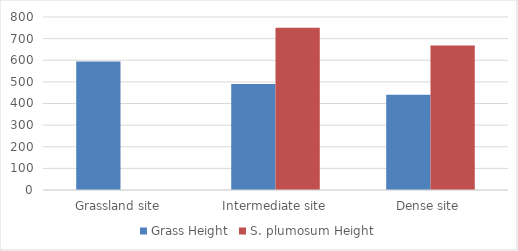
| Category | Grass Height | S. plumosum Height |
|---|---|---|
| Grassland site | 594 | 0 |
| Intermediate site | 490 | 750 |
| Dense site | 440 | 668 |